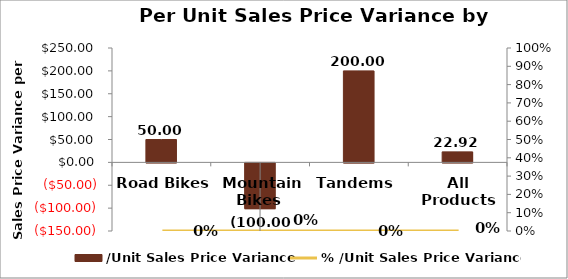
| Category | /Unit Sales Price Variance |
|---|---|
| Road Bikes  | 50 |
| Mountain Bikes  | -100 |
| Tandems  | 200 |
| All Products | 22.92 |